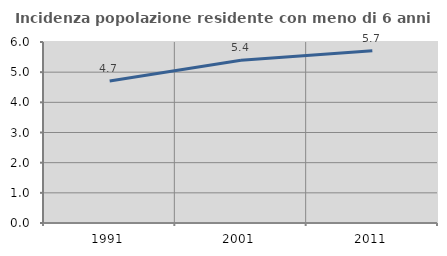
| Category | Incidenza popolazione residente con meno di 6 anni |
|---|---|
| 1991.0 | 4.708 |
| 2001.0 | 5.397 |
| 2011.0 | 5.708 |